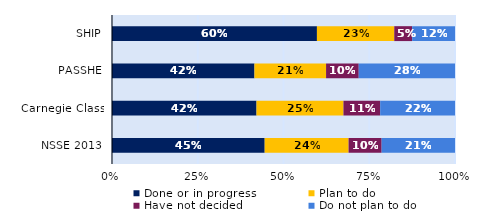
| Category | Done or in progress | Plan to do | Have not decided | Do not plan to do |
|---|---|---|---|---|
| SHIP | 0.597 | 0.225 | 0.052 | 0.125 |
| PASSHE | 0.415 | 0.209 | 0.095 | 0.281 |
| Carnegie Class | 0.421 | 0.254 | 0.107 | 0.218 |
| NSSE 2013 | 0.445 | 0.245 | 0.096 | 0.214 |